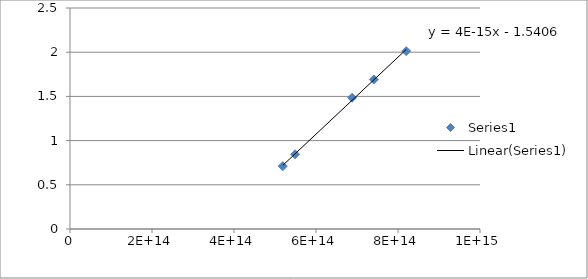
| Category | Series 0 |
|---|---|
| 819999999999999.9 | 2.012 |
| 741000000000000.0 | 1.691 |
| 688000000000000.0 | 1.485 |
| 549000000000000.0 | 0.845 |
| 519000000000000.06 | 0.711 |